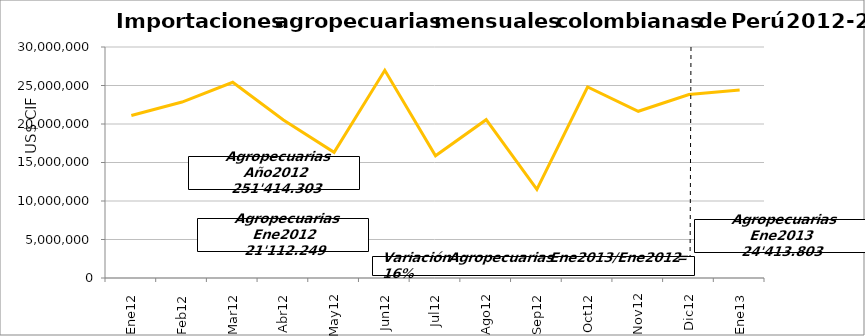
| Category | Agropecuarias |
|---|---|
| 0 | 21112248.95 |
| 1 | 22852031.14 |
| 2 | 25418172.78 |
| 3 | 20510087.25 |
| 4 | 16323458.65 |
| 5 | 26970002.48 |
| 6 | 15868235.51 |
| 7 | 20564059.24 |
| 8 | 11518481.84 |
| 9 | 24805656.25 |
| 10 | 21649677.9 |
| 11 | 23822191.5 |
| 12 | 24413802.54 |